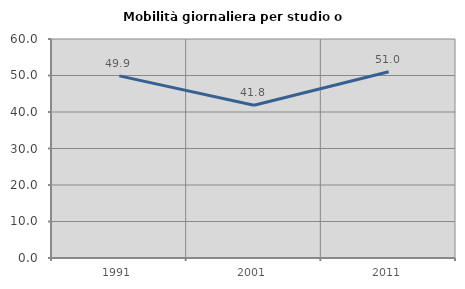
| Category | Mobilità giornaliera per studio o lavoro |
|---|---|
| 1991.0 | 49.89 |
| 2001.0 | 41.848 |
| 2011.0 | 51.037 |